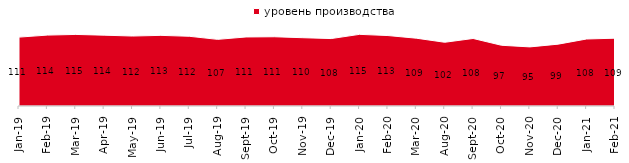
| Category | уровень производства |
|---|---|
| 2019-01-01 | 110.55 |
| 2019-02-01 | 113.8 |
| 2019-03-01 | 114.868 |
| 2019-04-01 | 113.663 |
| 2019-05-01 | 112.283 |
| 2019-06-01 | 113.367 |
| 2019-07-01 | 111.881 |
| 2019-08-01 | 106.943 |
| 2019-09-01 | 110.792 |
| 2019-10-01 | 111.139 |
| 2019-11-01 | 109.604 |
| 2019-12-01 | 108.218 |
| 2020-01-01 | 115 |
| 2020-02-01 | 113.069 |
| 2020-03-01 | 108.825 |
| 2020-08-01 | 102.284 |
| 2020-09-01 | 108.362 |
| 2020-10-01 | 97.459 |
| 2020-11-01 | 94.85 |
| 2020-12-01 | 99.256 |
| 2021-01-01 | 107.551 |
| 2021-02-01 | 108.834 |